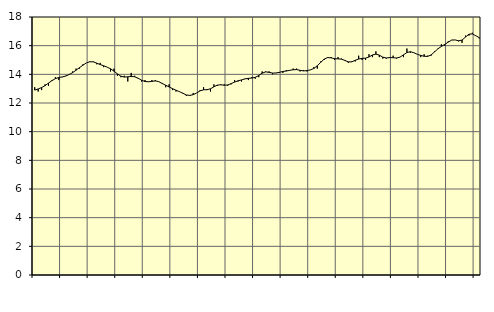
| Category | Piggar | Vård och omsorg, SNI 86-88 |
|---|---|---|
| nan | 13.1 | 12.9 |
| 87.0 | 12.8 | 12.98 |
| 87.0 | 12.9 | 13.08 |
| 87.0 | 13.3 | 13.21 |
| nan | 13.2 | 13.39 |
| 88.0 | 13.6 | 13.56 |
| 88.0 | 13.8 | 13.7 |
| 88.0 | 13.6 | 13.78 |
| nan | 13.8 | 13.82 |
| 89.0 | 13.9 | 13.88 |
| 89.0 | 14 | 13.99 |
| 89.0 | 14.2 | 14.12 |
| nan | 14.4 | 14.29 |
| 90.0 | 14.4 | 14.47 |
| 90.0 | 14.7 | 14.64 |
| 90.0 | 14.8 | 14.8 |
| nan | 14.9 | 14.88 |
| 91.0 | 14.9 | 14.87 |
| 91.0 | 14.7 | 14.78 |
| 91.0 | 14.8 | 14.68 |
| nan | 14.5 | 14.6 |
| 92.0 | 14.5 | 14.5 |
| 92.0 | 14.2 | 14.39 |
| 92.0 | 14.4 | 14.22 |
| nan | 13.9 | 14.03 |
| 93.0 | 13.8 | 13.87 |
| 93.0 | 13.9 | 13.81 |
| 93.0 | 13.5 | 13.83 |
| nan | 14.1 | 13.85 |
| 94.0 | 13.9 | 13.83 |
| 94.0 | 13.7 | 13.73 |
| 94.0 | 13.5 | 13.59 |
| nan | 13.6 | 13.5 |
| 95.0 | 13.5 | 13.48 |
| 95.0 | 13.6 | 13.51 |
| 95.0 | 13.6 | 13.54 |
| nan | 13.5 | 13.49 |
| 96.0 | 13.4 | 13.36 |
| 96.0 | 13.1 | 13.24 |
| 96.0 | 13.3 | 13.12 |
| nan | 12.9 | 13 |
| 97.0 | 12.8 | 12.89 |
| 97.0 | 12.8 | 12.79 |
| 97.0 | 12.7 | 12.68 |
| nan | 12.5 | 12.56 |
| 98.0 | 12.5 | 12.53 |
| 98.0 | 12.7 | 12.58 |
| 98.0 | 12.7 | 12.7 |
| nan | 12.9 | 12.85 |
| 99.0 | 13.1 | 12.92 |
| 99.0 | 12.9 | 12.93 |
| 99.0 | 12.8 | 12.99 |
| nan | 13.3 | 13.13 |
| 0.0 | 13.2 | 13.25 |
| 0.0 | 13.3 | 13.27 |
| 0.0 | 13.3 | 13.24 |
| nan | 13.2 | 13.26 |
| 1.0 | 13.3 | 13.35 |
| 1.0 | 13.6 | 13.46 |
| 1.0 | 13.5 | 13.55 |
| nan | 13.5 | 13.61 |
| 2.0 | 13.7 | 13.68 |
| 2.0 | 13.6 | 13.72 |
| 2.0 | 13.8 | 13.74 |
| nan | 13.7 | 13.79 |
| 3.0 | 13.8 | 13.92 |
| 3.0 | 14.2 | 14.08 |
| 3.0 | 14.2 | 14.17 |
| nan | 14.2 | 14.14 |
| 4.0 | 14 | 14.09 |
| 4.0 | 14.1 | 14.09 |
| 4.0 | 14.1 | 14.14 |
| nan | 14.1 | 14.2 |
| 5.0 | 14.3 | 14.23 |
| 5.0 | 14.3 | 14.28 |
| 5.0 | 14.4 | 14.32 |
| nan | 14.4 | 14.33 |
| 6.0 | 14.2 | 14.28 |
| 6.0 | 14.3 | 14.24 |
| 6.0 | 14.2 | 14.26 |
| nan | 14.3 | 14.31 |
| 7.0 | 14.5 | 14.41 |
| 7.0 | 14.4 | 14.6 |
| 7.0 | 14.9 | 14.84 |
| nan | 15 | 15.06 |
| 8.0 | 15.2 | 15.17 |
| 8.0 | 15.2 | 15.15 |
| 8.0 | 15 | 15.09 |
| nan | 15.2 | 15.08 |
| 9.0 | 15.1 | 15.06 |
| 9.0 | 15 | 14.97 |
| 9.0 | 14.8 | 14.87 |
| nan | 14.9 | 14.87 |
| 10.0 | 14.9 | 14.98 |
| 10.0 | 15.3 | 15.07 |
| 10.0 | 15 | 15.11 |
| nan | 15 | 15.13 |
| 11.0 | 15.4 | 15.21 |
| 11.0 | 15.2 | 15.35 |
| 11.0 | 15.6 | 15.41 |
| nan | 15.2 | 15.34 |
| 12.0 | 15.1 | 15.2 |
| 12.0 | 15.1 | 15.14 |
| 12.0 | 15.2 | 15.17 |
| nan | 15.3 | 15.16 |
| 13.0 | 15.1 | 15.14 |
| 13.0 | 15.2 | 15.2 |
| 13.0 | 15.2 | 15.36 |
| nan | 15.8 | 15.52 |
| 14.0 | 15.5 | 15.58 |
| 14.0 | 15.5 | 15.51 |
| 14.0 | 15.4 | 15.4 |
| nan | 15.2 | 15.32 |
| 15.0 | 15.4 | 15.26 |
| 15.0 | 15.3 | 15.25 |
| 15.0 | 15.3 | 15.35 |
| nan | 15.6 | 15.56 |
| 16.0 | 15.8 | 15.78 |
| 16.0 | 16.1 | 15.95 |
| 16.0 | 16 | 16.09 |
| nan | 16.3 | 16.25 |
| 17.0 | 16.4 | 16.39 |
| 17.0 | 16.4 | 16.4 |
| 17.0 | 16.3 | 16.34 |
| nan | 16.2 | 16.39 |
| 18.0 | 16.7 | 16.6 |
| 18.0 | 16.7 | 16.8 |
| 18.0 | 16.9 | 16.82 |
| nan | 16.7 | 16.69 |
| 19.0 | 16.5 | 16.56 |